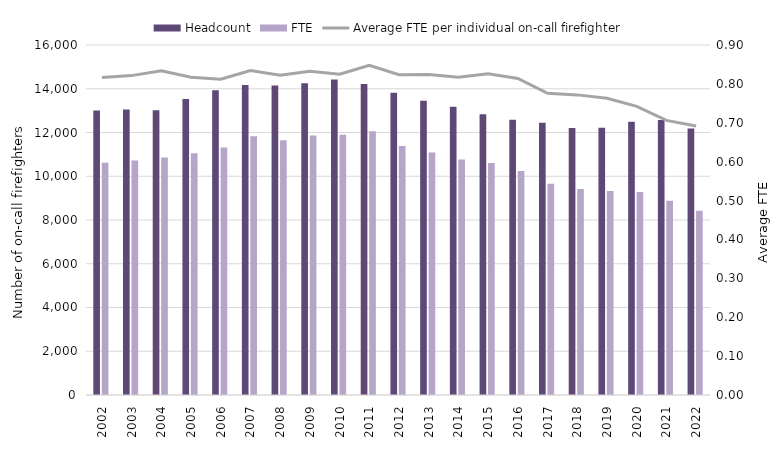
| Category | Headcount | FTE |
|---|---|---|
| 2002.0 | 13002 | 10613 |
| 2003.0 | 13048 | 10716 |
| 2004.0 | 13015 | 10853 |
| 2005.0 | 13529 | 11056 |
| 2006.0 | 13927 | 11312 |
| 2007.0 | 14174 | 11827 |
| 2008.0 | 14154 | 11642 |
| 2009.0 | 14256 | 11865 |
| 2010.0 | 14427 | 11898 |
| 2011.0 | 14221 | 12055 |
| 2012.0 | 13813 | 11379 |
| 2013.0 | 13455 | 11088 |
| 2014.0 | 13177 | 10768 |
| 2015.0 | 12837 | 10602 |
| 2016.0 | 12581 | 10241 |
| 2017.0 | 12450 | 9657 |
| 2018.0 | 12209 | 9422 |
| 2019.0 | 12221 | 9325 |
| 2020.0 | 12497 | 9275 |
| 2021.0 | 12569 | 8876 |
| 2022.0 | 12179 | 8422 |